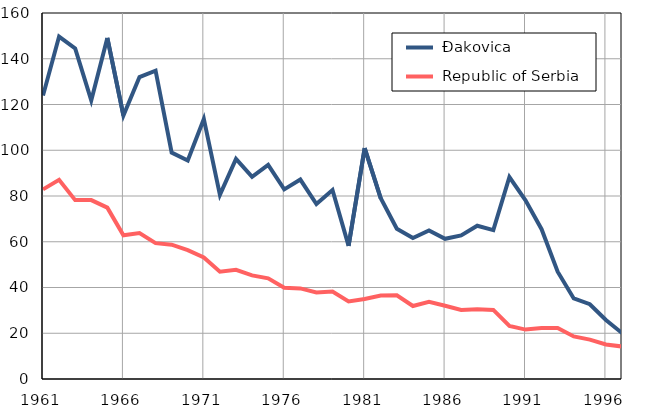
| Category |  Đakovica |  Republic of Serbia |
|---|---|---|
| 1961.0 | 123.9 | 82.9 |
| 1962.0 | 149.7 | 87.1 |
| 1963.0 | 144.5 | 78.2 |
| 1964.0 | 121.8 | 78.2 |
| 1965.0 | 149.1 | 74.9 |
| 1966.0 | 115.2 | 62.8 |
| 1967.0 | 132 | 63.8 |
| 1968.0 | 134.8 | 59.4 |
| 1969.0 | 99 | 58.7 |
| 1970.0 | 95.5 | 56.3 |
| 1971.0 | 113.7 | 53.1 |
| 1972.0 | 80.5 | 46.9 |
| 1973.0 | 96.2 | 47.7 |
| 1974.0 | 88.4 | 45.3 |
| 1975.0 | 93.6 | 44 |
| 1976.0 | 82.9 | 39.9 |
| 1977.0 | 87.2 | 39.6 |
| 1978.0 | 76.5 | 37.8 |
| 1979.0 | 82.6 | 38.2 |
| 1980.0 | 58.2 | 33.9 |
| 1981.0 | 100.9 | 35 |
| 1982.0 | 79 | 36.5 |
| 1983.0 | 65.7 | 36.6 |
| 1984.0 | 61.6 | 31.9 |
| 1985.0 | 64.9 | 33.7 |
| 1986.0 | 61.3 | 32 |
| 1987.0 | 62.8 | 30.2 |
| 1988.0 | 67 | 30.5 |
| 1989.0 | 65.1 | 30.2 |
| 1990.0 | 88.3 | 23.2 |
| 1991.0 | 78.1 | 21.6 |
| 1992.0 | 65.5 | 22.3 |
| 1993.0 | 46.9 | 22.3 |
| 1994.0 | 35.2 | 18.6 |
| 1995.0 | 32.7 | 17.2 |
| 1996.0 | 25.8 | 15.1 |
| 1997.0 | 20.1 | 14.2 |